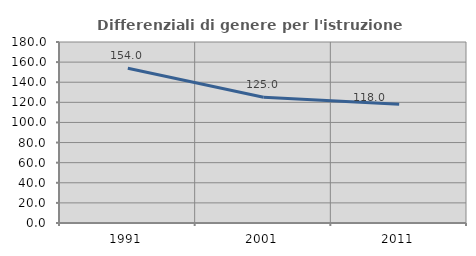
| Category | Differenziali di genere per l'istruzione superiore |
|---|---|
| 1991.0 | 153.972 |
| 2001.0 | 125.011 |
| 2011.0 | 118.007 |